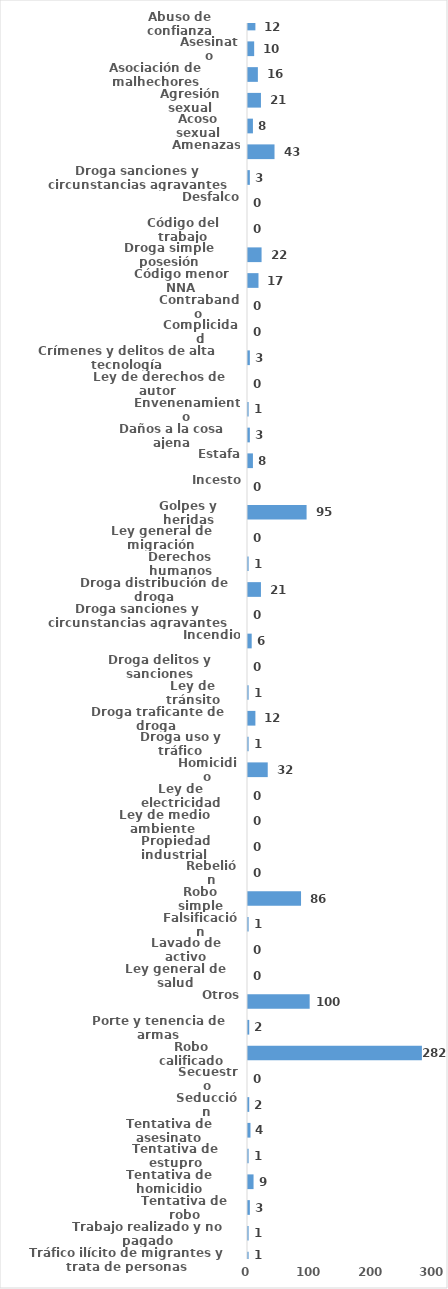
| Category | Series 0 |
|---|---|
| Abuso de confianza | 12 |
| Asesinato | 10 |
| Asociación de malhechores | 16 |
| Agresión sexual | 21 |
| Acoso sexual | 8 |
| Amenazas | 43 |
| Droga sanciones y circunstancias agravantes | 3 |
| Desfalco | 0 |
| Código del trabajo | 0 |
| Droga simple posesión | 22 |
| Código menor NNA | 17 |
| Contrabando | 0 |
| Complicidad | 0 |
| Crímenes y delitos de alta tecnología | 3 |
| Ley de derechos de autor  | 0 |
| Envenenamiento | 1 |
| Daños a la cosa ajena | 3 |
| Estafa | 8 |
| Incesto | 0 |
| Golpes y heridas | 95 |
| Ley general de migración | 0 |
| Derechos humanos | 1 |
| Droga distribución de droga | 21 |
| Droga sanciones y circunstancias agravantes | 0 |
| Incendio | 6 |
| Droga delitos y sanciones | 0 |
| Ley de tránsito | 1 |
| Droga traficante de droga  | 12 |
| Droga uso y tráfico | 1 |
| Homicidio | 32 |
| Ley de electricidad | 0 |
| Ley de medio ambiente  | 0 |
| Propiedad industrial  | 0 |
| Rebelión | 0 |
| Robo simple | 86 |
| Falsificación | 1 |
| Lavado de activo | 0 |
| Ley general de salud | 0 |
| Otros | 100 |
| Porte y tenencia de armas | 2 |
| Robo calificado | 282 |
| Secuestro | 0 |
| Seducción | 2 |
| Tentativa de asesinato | 4 |
| Tentativa de estupro | 1 |
| Tentativa de homicidio | 9 |
| Tentativa de robo | 3 |
| Trabajo realizado y no pagado | 1 |
| Tráfico ilícito de migrantes y trata de personas | 1 |